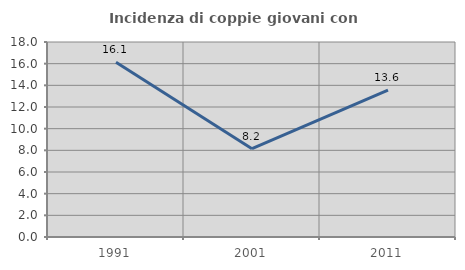
| Category | Incidenza di coppie giovani con figli |
|---|---|
| 1991.0 | 16.135 |
| 2001.0 | 8.152 |
| 2011.0 | 13.562 |